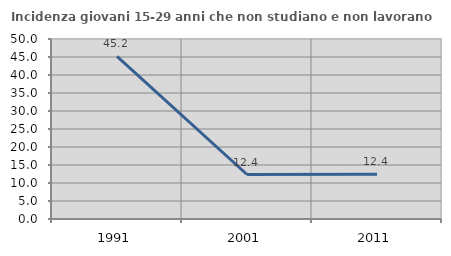
| Category | Incidenza giovani 15-29 anni che non studiano e non lavorano  |
|---|---|
| 1991.0 | 45.161 |
| 2001.0 | 12.361 |
| 2011.0 | 12.402 |